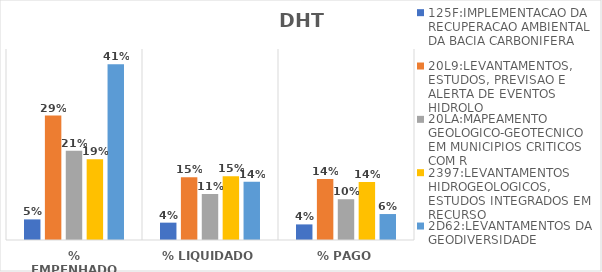
| Category | 125F:IMPLEMENTACAO DA RECUPERACAO AMBIENTAL DA BACIA CARBONIFERA | 20L9:LEVANTAMENTOS, ESTUDOS, PREVISAO E ALERTA DE EVENTOS HIDROLO | 20LA:MAPEAMENTO GEOLOGICO-GEOTECNICO EM MUNICIPIOS CRITICOS COM R | 2397:LEVANTAMENTOS HIDROGEOLOGICOS, ESTUDOS INTEGRADOS EM RECURSO | 2D62:LEVANTAMENTOS DA GEODIVERSIDADE |
|---|---|---|---|---|---|
| % EMPENHADO | 0.049 | 0.293 | 0.21 | 0.19 | 0.414 |
| % LIQUIDADO | 0.041 | 0.148 | 0.108 | 0.15 | 0.137 |
| % PAGO | 0.037 | 0.144 | 0.096 | 0.137 | 0.061 |